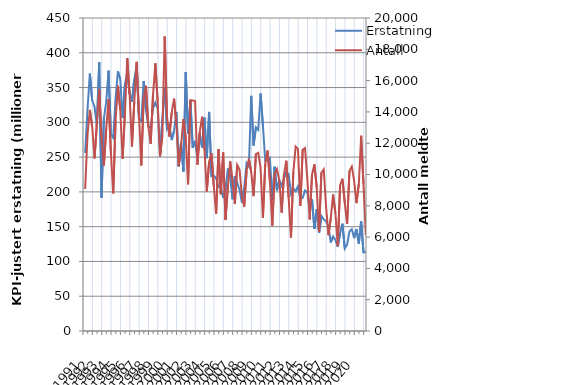
| Category | Erstatning |
|---|---|
| 1991.0 | 255.886 |
| nan | 318.368 |
| nan | 370.015 |
| nan | 331.4 |
| 1992.0 | 322.6 |
| nan | 294.766 |
| nan | 386.29 |
| nan | 191.585 |
| 1993.0 | 305.63 |
| nan | 329.304 |
| nan | 374.392 |
| nan | 282.696 |
| 1994.0 | 277.884 |
| nan | 334.599 |
| nan | 373.218 |
| nan | 362.084 |
| 1995.0 | 306.575 |
| nan | 354.65 |
| nan | 372.432 |
| nan | 341.038 |
| 1996.0 | 329.703 |
| nan | 361.938 |
| nan | 381.874 |
| nan | 305.3 |
| 1997.0 | 301.841 |
| nan | 359.509 |
| nan | 318.212 |
| nan | 294.175 |
| 1998.0 | 291.982 |
| nan | 320.299 |
| nan | 328.44 |
| nan | 319.603 |
| 1999.0 | 251.08 |
| nan | 304.66 |
| nan | 350.136 |
| nan | 290.408 |
| 2000.0 | 296.025 |
| nan | 274.529 |
| nan | 287.968 |
| nan | 314.82 |
| 2001.0 | 236.741 |
| nan | 271.533 |
| nan | 229.297 |
| nan | 371.9 |
| 2002.0 | 283.153 |
| nan | 331.963 |
| nan | 263.258 |
| nan | 273.322 |
| 2003.0 | 249.725 |
| nan | 282.969 |
| nan | 263.856 |
| nan | 306.798 |
| 2004.0 | 248.466 |
| nan | 314.976 |
| nan | 222.537 |
| nan | 223.466 |
| 2005.0 | 219.654 |
| nan | 207.02 |
| nan | 207.879 |
| nan | 191.437 |
| 2006.0 | 201.986 |
| nan | 233.583 |
| nan | 222.779 |
| nan | 189.37 |
| 2007.0 | 222.799 |
| nan | 212.832 |
| nan | 202.982 |
| nan | 184.866 |
| 2008.0 | 205.392 |
| nan | 241.499 |
| nan | 236.674 |
| nan | 338.103 |
| 2009.0 | 266.73 |
| nan | 292.74 |
| nan | 289.075 |
| nan | 341.428 |
| 2010.0 | 295.394 |
| nan | 244.587 |
| nan | 245.591 |
| nan | 248.519 |
| 2011.0 | 187.974 |
| nan | 236.129 |
| nan | 202.189 |
| nan | 217.026 |
| 2012.0 | 208.677 |
| nan | 218.734 |
| nan | 228.597 |
| nan | 225.594 |
| 2013.0 | 197.36 |
| nan | 205.137 |
| nan | 200.921 |
| nan | 208.167 |
| 2014.0 | 190.199 |
| nan | 191.416 |
| nan | 202.081 |
| nan | 198.936 |
| 2015.0 | 175.56 |
| nan | 189.155 |
| nan | 146.829 |
| nan | 174.991 |
| 2016.0 | 140.925 |
| nan | 165.396 |
| nan | 160.531 |
| nan | 157.627 |
| 2017.0 | 150.777 |
| nan | 127.258 |
| nan | 135.895 |
| nan | 130.672 |
| 2018.0 | 121.18 |
| nan | 140.64 |
| nan | 154.302 |
| nan | 118.645 |
| 2019.0 | 124.255 |
| nan | 143.17 |
| nan | 146.364 |
| nan | 133.443 |
| 2020.0 | 146.649 |
| nan | 125.513 |